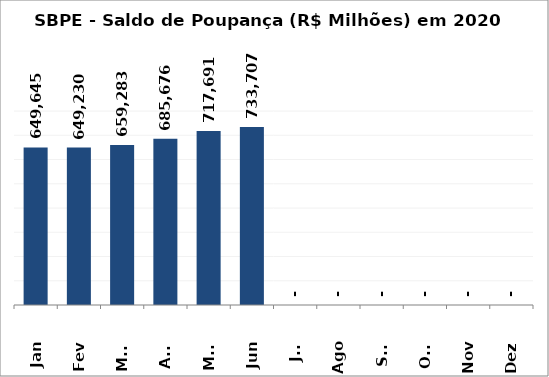
| Category | SBPE - Saldo de Poupança (R$ Milhões) em 2020 |
|---|---|
| Jan | 649645.04 |
| Fev | 649229.63 |
| Mar | 659283.469 |
| Abr | 685675.702 |
| Mai | 717690.899 |
| Jun | 733706.661 |
| Jul | 0 |
| Ago | 0 |
| Set | 0 |
| Out | 0 |
| Nov | 0 |
| Dez | 0 |